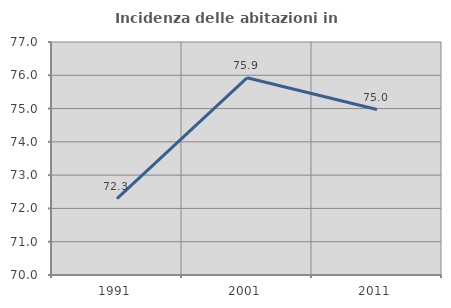
| Category | Incidenza delle abitazioni in proprietà  |
|---|---|
| 1991.0 | 72.295 |
| 2001.0 | 75.925 |
| 2011.0 | 74.971 |